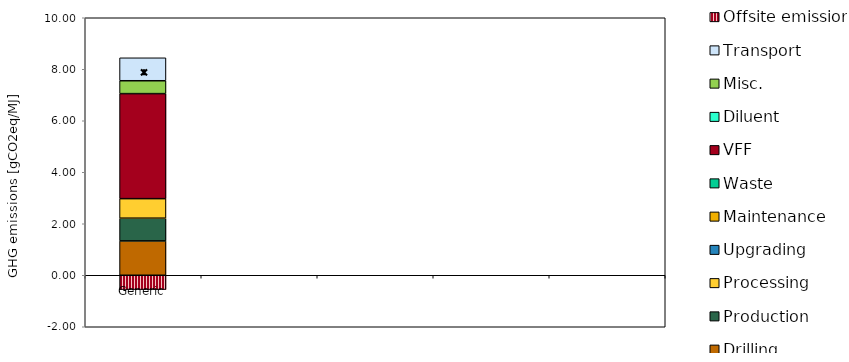
| Category | Exploration | Drilling | Production | Processing | Upgrading | Maintenance | Waste | VFF | Diluent | Misc. | Transport | Offsite emissions |
|---|---|---|---|---|---|---|---|---|---|---|---|---|
| Generic | 0 | 1.334 | 0.882 | 0.759 | 0 | 0 | 0 | 4.079 | 0 | 0.5 | 0.891 | -0.555 |